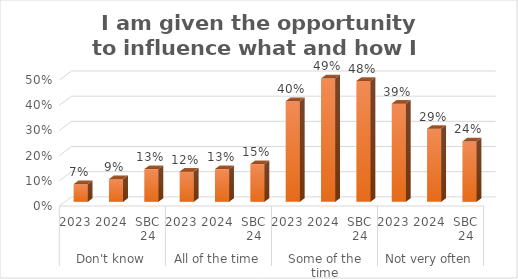
| Category |  I am given the opportunity to influence what and how I learn. |
|---|---|
| 0 | 0.07 |
| 1 | 0.09 |
| 2 | 0.13 |
| 3 | 0.12 |
| 4 | 0.13 |
| 5 | 0.15 |
| 6 | 0.4 |
| 7 | 0.49 |
| 8 | 0.48 |
| 9 | 0.39 |
| 10 | 0.29 |
| 11 | 0.24 |